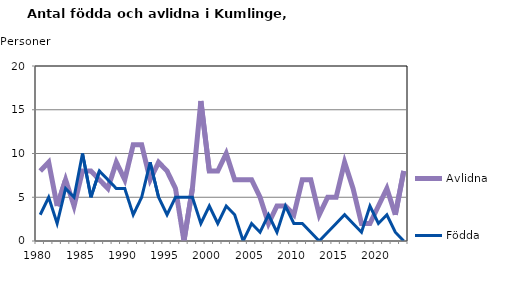
| Category | Avlidna | Födda |
|---|---|---|
| 1980.0 | 8 | 3 |
| 1981.0 | 9 | 5 |
| 1982.0 | 4 | 2 |
| 1983.0 | 7 | 6 |
| 1984.0 | 4 | 5 |
| 1985.0 | 8 | 10 |
| 1986.0 | 8 | 5 |
| 1987.0 | 7 | 8 |
| 1988.0 | 6 | 7 |
| 1989.0 | 9 | 6 |
| 1990.0 | 7 | 6 |
| 1991.0 | 11 | 3 |
| 1992.0 | 11 | 5 |
| 1993.0 | 7 | 9 |
| 1994.0 | 9 | 5 |
| 1995.0 | 8 | 3 |
| 1996.0 | 6 | 5 |
| 1997.0 | 0 | 5 |
| 1998.0 | 6 | 5 |
| 1999.0 | 16 | 2 |
| 2000.0 | 8 | 4 |
| 2001.0 | 8 | 2 |
| 2002.0 | 10 | 4 |
| 2003.0 | 7 | 3 |
| 2004.0 | 7 | 0 |
| 2005.0 | 7 | 2 |
| 2006.0 | 5 | 1 |
| 2007.0 | 2 | 3 |
| 2008.0 | 4 | 1 |
| 2009.0 | 4 | 4 |
| 2010.0 | 3 | 2 |
| 2011.0 | 7 | 2 |
| 2012.0 | 7 | 1 |
| 2013.0 | 3 | 0 |
| 2014.0 | 5 | 1 |
| 2015.0 | 5 | 2 |
| 2016.0 | 9 | 3 |
| 2017.0 | 6 | 2 |
| 2018.0 | 2 | 1 |
| 2019.0 | 2 | 4 |
| 2020.0 | 4 | 2 |
| 2021.0 | 6 | 3 |
| 2022.0 | 3 | 1 |
| 2023.0 | 8 | 0 |